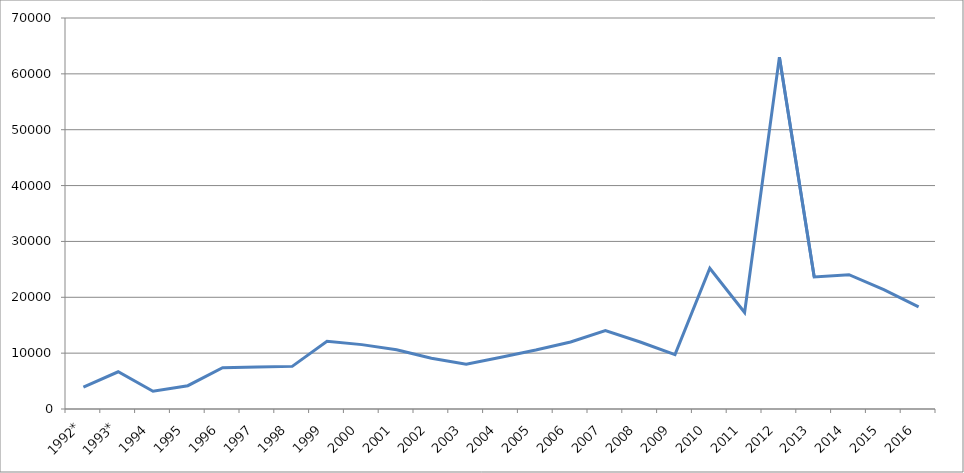
| Category | Series 0 |
|---|---|
| 1992* | 3895 |
| 1993* | 6667 |
| 1994 | 3180 |
| 1995 | 4174 |
| 1996 | 7380 |
| 1997 | 7504 |
| 1998 | 7630 |
| 1999 | 12131 |
| 2000 | 11525.4 |
| 2001 | 10613 |
| 2002 | 9078.2 |
| 2003 | 8008.3 |
| 2004 | 9277.4 |
| 2005 | 10552.1 |
| 2006 | 11993.65 |
| 2007 | 14060.6 |
| 2008 | 11996.95 |
| 2009 | 9729.8 |
| 2010 | 25200.2 |
| 2011 | 17284.85 |
| 2012 | 62998 |
| 2013 | 23653.7 |
| 2014 | 24037.3 |
| 2015 | 21354.1 |
| 2016 | 18273.7 |